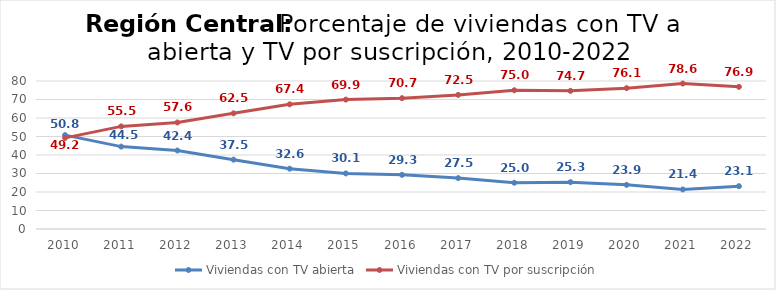
| Category | Viviendas con TV abierta | Viviendas con TV por suscripción |
|---|---|---|
| 2010.0 | 50.75 | 49.25 |
| 2011.0 | 44.541 | 55.459 |
| 2012.0 | 42.427 | 57.573 |
| 2013.0 | 37.479 | 62.521 |
| 2014.0 | 32.602 | 67.398 |
| 2015.0 | 30.052 | 69.948 |
| 2016.0 | 29.288 | 70.712 |
| 2017.0 | 27.515 | 72.485 |
| 2018.0 | 25.01 | 74.99 |
| 2019.0 | 25.32 | 74.68 |
| 2020.0 | 23.871 | 76.129 |
| 2021.0 | 21.369 | 78.631 |
| 2022.0 | 23.149 | 76.851 |